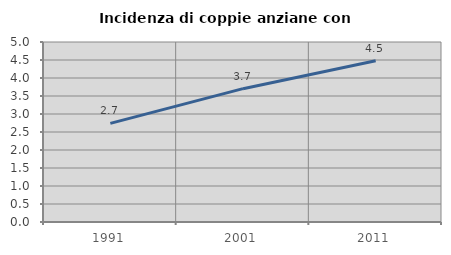
| Category | Incidenza di coppie anziane con figli |
|---|---|
| 1991.0 | 2.74 |
| 2001.0 | 3.704 |
| 2011.0 | 4.478 |